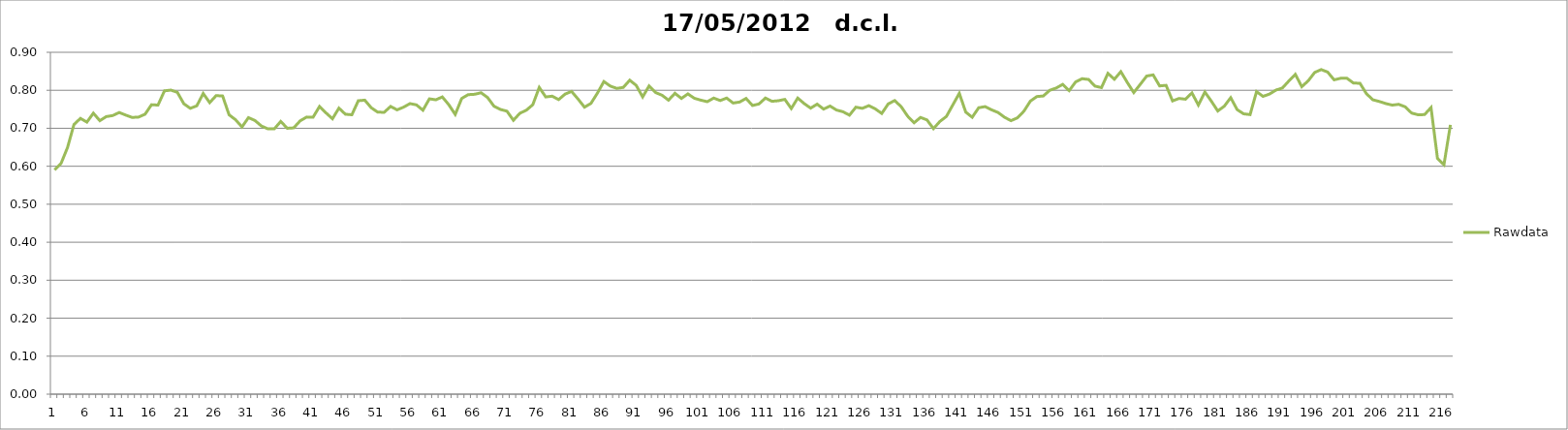
| Category | Rawdata |
|---|---|
| 0 | 0.59 |
| 1 | 0.608 |
| 2 | 0.649 |
| 3 | 0.71 |
| 4 | 0.726 |
| 5 | 0.716 |
| 6 | 0.74 |
| 7 | 0.72 |
| 8 | 0.731 |
| 9 | 0.734 |
| 10 | 0.742 |
| 11 | 0.735 |
| 12 | 0.728 |
| 13 | 0.73 |
| 14 | 0.737 |
| 15 | 0.762 |
| 16 | 0.761 |
| 17 | 0.799 |
| 18 | 0.8 |
| 19 | 0.794 |
| 20 | 0.765 |
| 21 | 0.753 |
| 22 | 0.759 |
| 23 | 0.792 |
| 24 | 0.768 |
| 25 | 0.786 |
| 26 | 0.785 |
| 27 | 0.736 |
| 28 | 0.723 |
| 29 | 0.704 |
| 30 | 0.728 |
| 31 | 0.721 |
| 32 | 0.706 |
| 33 | 0.699 |
| 34 | 0.699 |
| 35 | 0.718 |
| 36 | 0.7 |
| 37 | 0.701 |
| 38 | 0.72 |
| 39 | 0.73 |
| 40 | 0.729 |
| 41 | 0.758 |
| 42 | 0.74 |
| 43 | 0.725 |
| 44 | 0.753 |
| 45 | 0.737 |
| 46 | 0.736 |
| 47 | 0.772 |
| 48 | 0.774 |
| 49 | 0.754 |
| 50 | 0.742 |
| 51 | 0.742 |
| 52 | 0.758 |
| 53 | 0.748 |
| 54 | 0.756 |
| 55 | 0.765 |
| 56 | 0.762 |
| 57 | 0.748 |
| 58 | 0.778 |
| 59 | 0.775 |
| 60 | 0.782 |
| 61 | 0.762 |
| 62 | 0.736 |
| 63 | 0.779 |
| 64 | 0.788 |
| 65 | 0.79 |
| 66 | 0.794 |
| 67 | 0.781 |
| 68 | 0.758 |
| 69 | 0.75 |
| 70 | 0.745 |
| 71 | 0.721 |
| 72 | 0.74 |
| 73 | 0.748 |
| 74 | 0.762 |
| 75 | 0.808 |
| 76 | 0.782 |
| 77 | 0.784 |
| 78 | 0.776 |
| 79 | 0.79 |
| 80 | 0.797 |
| 81 | 0.777 |
| 82 | 0.756 |
| 83 | 0.766 |
| 84 | 0.793 |
| 85 | 0.823 |
| 86 | 0.811 |
| 87 | 0.805 |
| 88 | 0.808 |
| 89 | 0.826 |
| 90 | 0.813 |
| 91 | 0.782 |
| 92 | 0.812 |
| 93 | 0.794 |
| 94 | 0.787 |
| 95 | 0.774 |
| 96 | 0.792 |
| 97 | 0.778 |
| 98 | 0.79 |
| 99 | 0.779 |
| 100 | 0.774 |
| 101 | 0.77 |
| 102 | 0.78 |
| 103 | 0.773 |
| 104 | 0.78 |
| 105 | 0.766 |
| 106 | 0.769 |
| 107 | 0.778 |
| 108 | 0.76 |
| 109 | 0.764 |
| 110 | 0.78 |
| 111 | 0.771 |
| 112 | 0.773 |
| 113 | 0.776 |
| 114 | 0.752 |
| 115 | 0.78 |
| 116 | 0.765 |
| 117 | 0.753 |
| 118 | 0.764 |
| 119 | 0.75 |
| 120 | 0.759 |
| 121 | 0.748 |
| 122 | 0.744 |
| 123 | 0.735 |
| 124 | 0.756 |
| 125 | 0.753 |
| 126 | 0.76 |
| 127 | 0.751 |
| 128 | 0.739 |
| 129 | 0.764 |
| 130 | 0.773 |
| 131 | 0.757 |
| 132 | 0.732 |
| 133 | 0.715 |
| 134 | 0.729 |
| 135 | 0.722 |
| 136 | 0.699 |
| 137 | 0.718 |
| 138 | 0.731 |
| 139 | 0.762 |
| 140 | 0.792 |
| 141 | 0.742 |
| 142 | 0.729 |
| 143 | 0.754 |
| 144 | 0.757 |
| 145 | 0.748 |
| 146 | 0.742 |
| 147 | 0.729 |
| 148 | 0.72 |
| 149 | 0.728 |
| 150 | 0.745 |
| 151 | 0.772 |
| 152 | 0.784 |
| 153 | 0.785 |
| 154 | 0.8 |
| 155 | 0.806 |
| 156 | 0.816 |
| 157 | 0.799 |
| 158 | 0.822 |
| 159 | 0.83 |
| 160 | 0.828 |
| 161 | 0.811 |
| 162 | 0.807 |
| 163 | 0.844 |
| 164 | 0.829 |
| 165 | 0.849 |
| 166 | 0.82 |
| 167 | 0.794 |
| 168 | 0.816 |
| 169 | 0.838 |
| 170 | 0.84 |
| 171 | 0.812 |
| 172 | 0.813 |
| 173 | 0.772 |
| 174 | 0.778 |
| 175 | 0.777 |
| 176 | 0.793 |
| 177 | 0.761 |
| 178 | 0.796 |
| 179 | 0.772 |
| 180 | 0.746 |
| 181 | 0.758 |
| 182 | 0.78 |
| 183 | 0.749 |
| 184 | 0.738 |
| 185 | 0.736 |
| 186 | 0.796 |
| 187 | 0.784 |
| 188 | 0.79 |
| 189 | 0.8 |
| 190 | 0.806 |
| 191 | 0.824 |
| 192 | 0.842 |
| 193 | 0.81 |
| 194 | 0.825 |
| 195 | 0.847 |
| 196 | 0.854 |
| 197 | 0.848 |
| 198 | 0.828 |
| 199 | 0.832 |
| 200 | 0.832 |
| 201 | 0.819 |
| 202 | 0.818 |
| 203 | 0.791 |
| 204 | 0.775 |
| 205 | 0.771 |
| 206 | 0.765 |
| 207 | 0.761 |
| 208 | 0.763 |
| 209 | 0.757 |
| 210 | 0.74 |
| 211 | 0.736 |
| 212 | 0.736 |
| 213 | 0.755 |
| 214 | 0.62 |
| 215 | 0.604 |
| 216 | 0.709 |